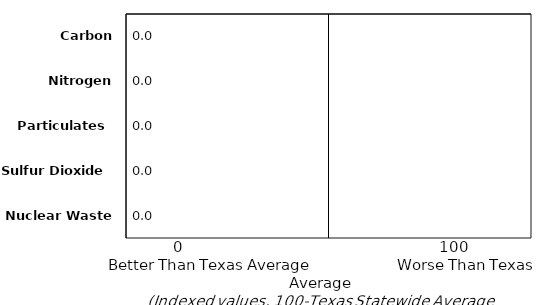
| Category | Index |
|---|---|
| Carbon Dioxide | 0 |
| Nitrogen Oxides | 0 |
| Particulates | 0 |
| Sulfur Dioxide | 0 |
| Nuclear Waste | 0 |